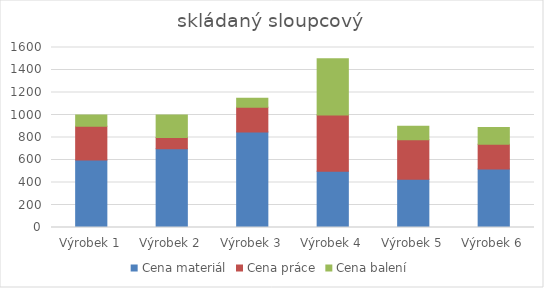
| Category | Cena materiál | Cena práce | Cena balení |
|---|---|---|---|
| Výrobek 1 | 600 | 300 | 100 |
| Výrobek 2 | 700 | 100 | 200 |
| Výrobek 3 | 850 | 220 | 80 |
| Výrobek 4 | 500 | 500 | 500 |
| Výrobek 5 | 430 | 350 | 120 |
| Výrobek 6 | 520 | 220 | 150 |